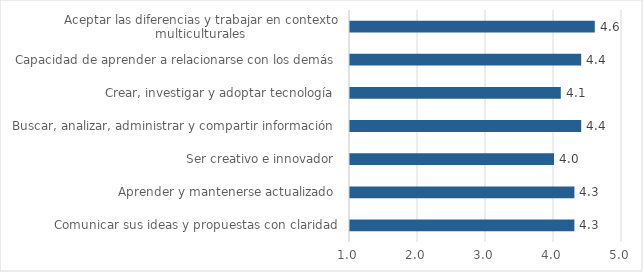
| Category | Series 5 | Promedio |
|---|---|---|
| Comunicar sus ideas y propuestas con claridad |  | 4.3 |
| Aprender y mantenerse actualizado  |  | 4.3 |
| Ser creativo e innovador  |  | 4 |
| Buscar, analizar, administrar y compartir información  |  | 4.4 |
| Crear, investigar y adoptar tecnología  |  | 4.1 |
| Capacidad de aprender a relacionarse con los demás  |  | 4.4 |
| Aceptar las diferencias y trabajar en contexto multiculturales  |  | 4.6 |